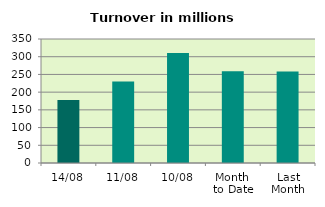
| Category | Series 0 |
|---|---|
| 14/08 | 177.96 |
| 11/08 | 230.196 |
| 10/08 | 310.505 |
| Month 
to Date | 259.223 |
| Last
Month | 258.125 |